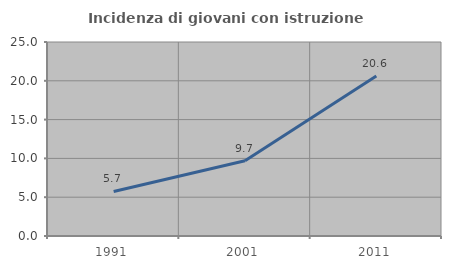
| Category | Incidenza di giovani con istruzione universitaria |
|---|---|
| 1991.0 | 5.739 |
| 2001.0 | 9.69 |
| 2011.0 | 20.61 |